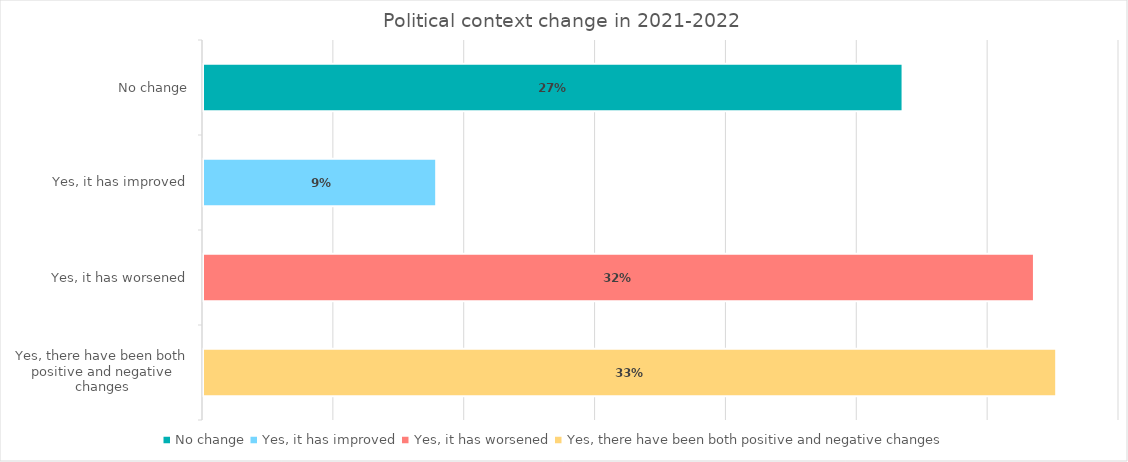
| Category | Series 0 |
|---|---|
| No change | 0.267 |
| Yes, it has improved | 0.089 |
| Yes, it has worsened | 0.318 |
| Yes, there have been both positive and negative changes | 0.326 |